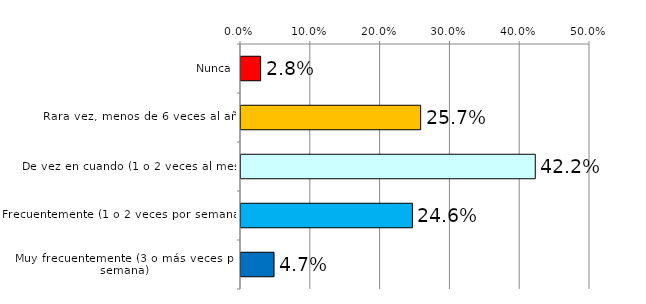
| Category | Series 1 |
|---|---|
| Nunca | 0.028 |
| Rara vez, menos de 6 veces al año | 0.257 |
| De vez en cuando (1 o 2 veces al mes) | 0.422 |
| Frecuentemente (1 o 2 veces por semana) | 0.246 |
| Muy frecuentemente (3 o más veces por semana) | 0.047 |